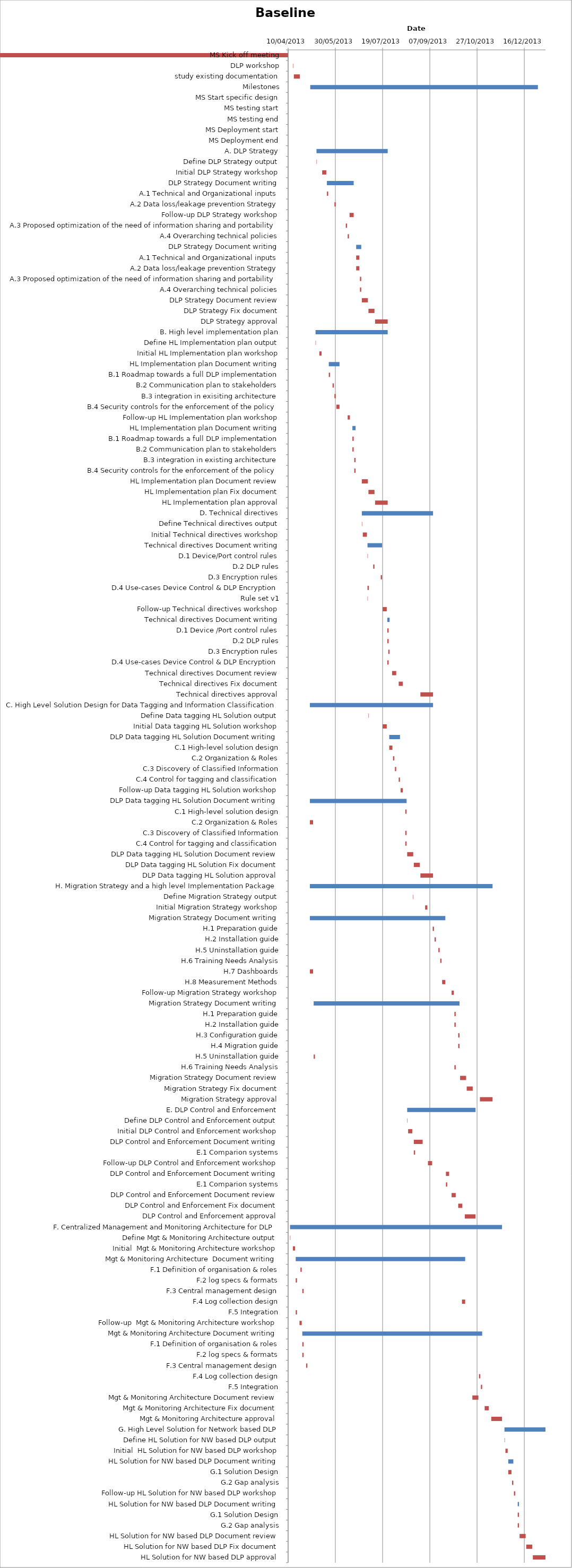
| Category | Baseline start | Actual duration |
|---|---|---|
| MS Kick off meeting | 41374.333 | -0.625 |
| DLP workshop | 41379.333 | 0.375 |
| study existing documentation | 41380.333 | 6.375 |
| Milestones | 41397.708 | 241 |
| MS Start specific design | 41397.708 | 0 |
| MS testing start | 41460.708 | 0 |
| MS testing end | 41530.708 | 0 |
| MS Deployment start | 41547.708 | 0 |
| MS Deployment end | 41638.708 | 0 |
| A. DLP Strategy | 41404.333 | 75.375 |
| Define DLP Strategy output | 41404.333 | 0.375 |
| Initial DLP Strategy workshop | 41410.333 | 4.375 |
| DLP Strategy Document writing | 41415.333 | 28.375 |
| A.1 Technical and Organizational inputs | 41415.333 | 1.375 |
| A.2 Data loss/leakage prevention Strategy | 41423.333 | 1.375 |
| Follow-up DLP Strategy workshop | 41439.333 | 4.375 |
| A.3 Proposed optimization of the need of information sharing and portability | 41435.333 | 1.375 |
| A.4 Overarching technical policies | 41437.333 | 1.375 |
| DLP Strategy Document writing | 41446.333 | 5.375 |
| A.1 Technical and Organizational inputs | 41446.333 | 3.375 |
| A.2 Data loss/leakage prevention Strategy | 41446.333 | 3.375 |
| A.3 Proposed optimization of the need of information sharing and portability | 41450.333 | 1.375 |
| A.4 Overarching technical policies | 41450.333 | 1.375 |
| DLP Strategy Document review | 41452.333 | 6.375 |
| DLP Strategy Fix document | 41459.333 | 6.375 |
| DLP Strategy approval | 41466.333 | 13.375 |
| B. High level implementation plan | 41403.333 | 76.375 |
| Define HL Implementation plan output | 41403.333 | 0.375 |
| Initial HL Implementation plan workshop | 41407.333 | 2.375 |
| HL Implementation plan Document writing | 41417.333 | 11.375 |
| B.1 Roadmap towards a full DLP implementation | 41417.333 | 1.375 |
| B.2 Communication plan to stakeholders | 41421.333 | 1.375 |
| B.3 integration in exisiting architecture | 41423.333 | 1.375 |
| B.4 Security controls for the enforcement of the policy | 41425.333 | 3.375 |
| Follow-up HL Implementation plan workshop | 41437.333 | 2.375 |
| HL Implementation plan Document writing | 41442.333 | 3.375 |
| B.1 Roadmap towards a full DLP implementation | 41442.333 | 1.375 |
| B.2 Communication plan to stakeholders | 41442.333 | 1.375 |
| B.3 integration in existing architecture | 41444.333 | 1.375 |
| B.4 Security controls for the enforcement of the policy | 41444.333 | 1.375 |
| HL Implementation plan Document review | 41452.333 | 6.375 |
| HL Implementation plan Fix document | 41459.333 | 6.375 |
| HL Implementation plan approval | 41466.333 | 13.375 |
| D. Technical directives | 41452.333 | 75.375 |
| Define Technical directives output | 41452.333 | 0.375 |
| Initial Technical directives workshop | 41453.333 | 4.375 |
| Technical directives Document writing | 41458.333 | 15.375 |
| D.1 Device/Port control rules | 41458.333 | 0.375 |
| D.2 DLP rules | 41464.333 | 1.375 |
| D.3 Encryption rules | 41472.333 | 1.375 |
| D.4 Use-cases Device Control & DLP Encryption | 41458.333 | 1.375 |
| Rule set v1 | 41458.333 | 0.375 |
| Follow-up Technical directives workshop | 41474.333 | 4.375 |
| Technical directives Document writing | 41479.333 | 2.375 |
| D.1 Device /Port control rules | 41479.333 | 1.375 |
| D.2 DLP rules | 41479.333 | 1.375 |
| D.3 Encryption rules | 41480.333 | 1.375 |
| D.4 Use-cases Device Control & DLP Encryption | 41479.333 | 1.375 |
| Technical directives Document review | 41484.333 | 4.375 |
| Technical directives Fix document | 41491.333 | 4.375 |
| Technical directives approval | 41514.333 | 13.375 |
| C. High Level Solution Design for Data Tagging and Information Classification | 41397.333 | 130.375 |
| Define Data tagging HL Solution output | 41459.333 | 0.375 |
| Initial Data tagging HL Solution workshop | 41474.333 | 4.375 |
| DLP Data tagging HL Solution Document writing | 41481.333 | 11.375 |
| C.1 High-level solution design | 41481.333 | 3.375 |
| C.2 Organization & Roles | 41485.333 | 1.375 |
| C.3 Discovery of Classified Information | 41487.333 | 1.375 |
| C.4 Control for tagging and classification | 41491.333 | 1.375 |
| Follow-up Data tagging HL Solution workshop | 41493.333 | 2.375 |
| DLP Data tagging HL Solution Document writing | 41397.333 | 102.375 |
| C.1 High-level solution design | 41498.333 | 1.375 |
| C.2 Organization & Roles | 41397.333 | 3.375 |
| C.3 Discovery of Classified Information | 41498.333 | 1.375 |
| C.4 Control for tagging and classification | 41498.333 | 1.375 |
| DLP Data tagging HL Solution Document review | 41500.333 | 6.375 |
| DLP Data tagging HL Solution Fix document | 41507.333 | 6.375 |
| DLP Data tagging HL Solution approval | 41514.333 | 13.375 |
| H. Migration Strategy and a high level Implementation Package | 41397.333 | 193.375 |
| Define Migration Strategy output | 41506.333 | 0.375 |
| Initial Migration Strategy workshop | 41519.333 | 2.375 |
| Migration Strategy Document writing | 41397.333 | 143.375 |
| H.1 Preparation guide | 41527.333 | 1.375 |
| H.2 Installation guide | 41529.333 | 1.375 |
| H.5 Uninstallation guide | 41533.333 | 1.375 |
| H.6 Training Needs Analysis | 41535.333 | 1.375 |
| H.7 Dashboards | 41397.333 | 3.375 |
| H.8 Measurement Methods | 41537.333 | 3.375 |
| Follow-up Migration Strategy workshop | 41547.333 | 2.375 |
| Migration Strategy Document writing | 41401.333 | 154.375 |
| H.1 Preparation guide | 41550.333 | 1.375 |
| H.2 Installation guide | 41550.333 | 1.375 |
| H.3 Configuration guide | 41554.333 | 1.375 |
| H.4 Migration guide | 41554.333 | 1.375 |
| H.5 Uninstallation guide | 41401.333 | 1.375 |
| H.6 Training Needs Analysis | 41550.333 | 1.375 |
| Migration Strategy Document review | 41556.333 | 6.375 |
| Migration Strategy Fix document | 41563.333 | 6.375 |
| Migration Strategy approval | 41577.333 | 13.375 |
| E. DLP Control and Enforcement | 41500.333 | 72.375 |
| Define DLP Control and Enforcement output | 41500.333 | 0.375 |
| Initial DLP Control and Enforcement workshop | 41501.333 | 4.375 |
| DLP Control and Enforcement Document writing | 41507.333 | 9.375 |
| E.1 Comparion systems | 41507.333 | 1.375 |
| Follow-up DLP Control and Enforcement workshop | 41522.333 | 4.375 |
| DLP Control and Enforcement Document writing | 41541.333 | 3.375 |
| E.1 Comparion systems | 41541.333 | 1.375 |
| DLP Control and Enforcement Document review | 41547.333 | 4.375 |
| DLP Control and Enforcement Fix document | 41554.333 | 4.375 |
| DLP Control and Enforcement approval | 41561.333 | 11.375 |
| F. Centralized Management and Monitoring Architecture for DLP | 41376.333 | 224.375 |
| Define Mgt & Monitoring Architecture output | 41376.333 | 0.375 |
| Initial  Mgt & Monitoring Architecture workshop | 41379.333 | 2.375 |
| Mgt & Monitoring Architecture  Document writing | 41382.333 | 179.375 |
| F.1 Definition of organisation & roles | 41387.333 | 1.375 |
| F.2 log specs & formats | 41382.333 | 1.375 |
| F.3 Central management design | 41389.333 | 1.375 |
| F.4 Log collection design | 41558.333 | 3.375 |
| F.5 Integration | 41382.333 | 1.375 |
| Follow-up  Mgt & Monitoring Architecture workshop | 41386.333 | 2.375 |
| Mgt & Monitoring Architecture Document writing | 41389.333 | 190.375 |
| F.1 Definition of organisation & roles | 41389.333 | 1.375 |
| F.2 log specs & formats | 41389.333 | 1.375 |
| F.3 Central management design | 41393.333 | 1.375 |
| F.4 Log collection design | 41576.333 | 1.375 |
| F.5 Integration | 41578.333 | 1.375 |
| Mgt & Monitoring Architecture Document review | 41569.333 | 6.375 |
| Mgt & Monitoring Architecture Fix document | 41582.333 | 4.375 |
| Mgt & Monitoring Architecture approval | 41589.333 | 11.375 |
| G. High Level Solution for Network based DLP | 41603.333 | 43.375 |
| Define HL Solution for NW based DLP output | 41603.333 | 0.375 |
| Initial  HL Solution for NW based DLP workshop | 41604.333 | 2.375 |
| HL Solution for NW based DLP Document writing | 41607.333 | 5.375 |
| G.1 Solution Design | 41607.333 | 3.375 |
| G.2 Gap analysis | 41611.333 | 1.375 |
| Follow-up HL Solution for NW based DLP workshop | 41613.333 | 1.375 |
| HL Solution for NW based DLP Document writing | 41617.333 | 1.375 |
| G.1 Solution Design | 41617.333 | 1.375 |
| G.2 Gap analysis | 41617.333 | 1.375 |
| HL Solution for NW based DLP Document review | 41619.333 | 6.375 |
| HL Solution for NW based DLP Fix document | 41626.333 | 6.375 |
| HL Solution for NW based DLP approval | 41633.333 | 13.375 |